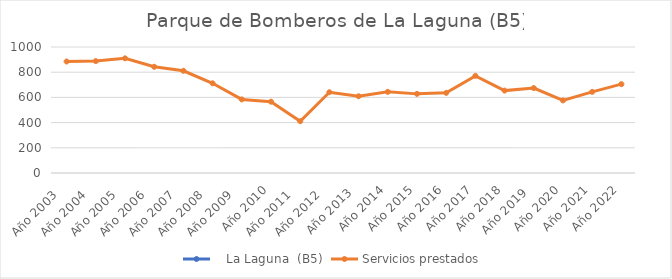
| Category |    La Laguna  (B5) | Servicios prestados  |
|---|---|---|
| Año 2003   |  | 885 |
| Año 2004   |  | 888 |
| Año 2005   |  | 910 |
| Año 2006   |  | 843 |
| Año 2007   |  | 811 |
| Año 2008   |  | 712 |
| Año 2009   |  | 584 |
| Año 2010 |  | 566 |
| Año 2011   |  | 411 |
| Año 2012   |  | 641 |
| Año 2013  |  | 609 |
| Año 2014 |  | 644 |
| Año 2015 |  | 628 |
| Año 2016 |  | 636 |
| Año 2017 |  | 771 |
| Año 2018 |  | 654 |
| Año 2019  |  | 674 |
| Año 2020 |  | 576 |
| Año 2021 |  | 644 |
| Año 2022 |  | 705 |